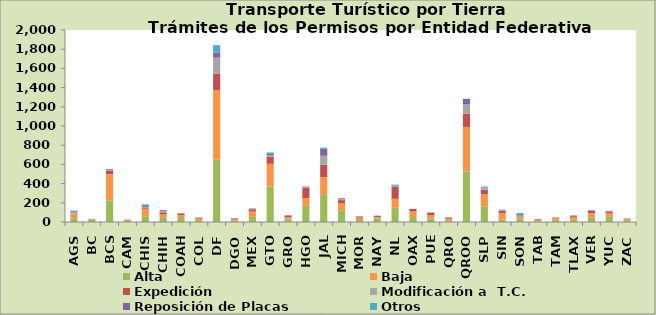
| Category | Alta                                         | Baja | Expedición | Modificación a  T.C. | Reposición de Placas | Otros |
|---|---|---|---|---|---|---|
| AGS | 39 | 44 | 3 | 20 | 10 | 2 |
| BC | 21 | 8 | 2 | 0 | 0 | 0 |
| BCS | 225 | 273 | 34 | 10 | 8 | 0 |
| CAM | 11 | 7 | 6 | 0 | 0 | 0 |
| CHIS | 61 | 77 | 13 | 6 | 10 | 17 |
| CHIH | 43 | 35 | 23 | 15 | 8 | 0 |
| COAH | 42 | 30 | 18 | 1 | 0 | 0 |
| COL | 11 | 21 | 8 | 6 | 2 | 0 |
| DF | 649 | 723 | 175 | 165 | 53 | 77 |
| DGO | 13 | 14 | 11 | 1 | 0 | 0 |
| MEX | 53 | 56 | 24 | 8 | 2 | 0 |
| GTO | 370 | 236 | 72 | 18 | 14 | 15 |
| GRO | 28 | 22 | 19 | 0 | 0 | 0 |
| HGO | 168 | 79 | 110 | 9 | 4 | 0 |
| JAL | 282 | 184 | 132 | 92 | 74 | 11 |
| MICH | 117 | 78 | 33 | 11 | 8 | 0 |
| MOR | 21 | 25 | 12 | 0 | 0 | 0 |
| NAY | 39 | 14 | 11 | 0 | 2 | 0 |
| NL | 148 | 93 | 125 | 5 | 6 | 12 |
| OAX | 52 | 57 | 28 | 0 | 0 | 0 |
| PUE | 35 | 35 | 24 | 2 | 4 | 0 |
| QRO | 13 | 22 | 12 | 4 | 0 | 0 |
| QROO | 527 | 463 | 138 | 98 | 56 | 2 |
| SLP | 163 | 127 | 47 | 25 | 4 | 3 |
| SIN | 23 | 68 | 26 | 13 | 0 | 0 |
| SON | 36 | 26 | 8 | 2 | 0 | 21 |
| TAB | 7 | 11 | 10 | 0 | 0 | 0 |
| TAM | 19 | 27 | 0 | 3 | 2 | 0 |
| TLAX | 29 | 25 | 12 | 1 | 2 | 0 |
| VER | 50 | 42 | 26 | 3 | 2 | 2 |
| YUC | 53 | 40 | 14 | 6 | 4 | 0 |
| ZAC | 19 | 10 | 7 | 0 | 0 | 0 |